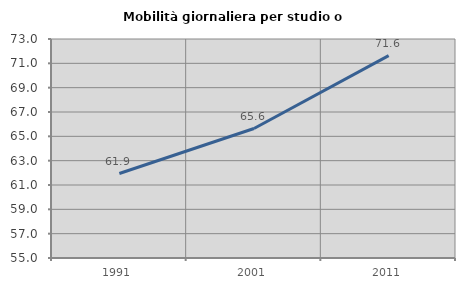
| Category | Mobilità giornaliera per studio o lavoro |
|---|---|
| 1991.0 | 61.943 |
| 2001.0 | 65.642 |
| 2011.0 | 71.638 |